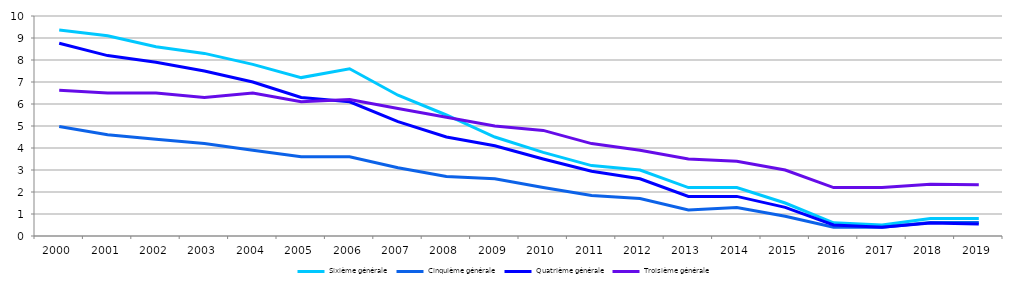
| Category | Sixième générale | Cinquième générale | Quatrième générale | Troisième générale |
|---|---|---|---|---|
| 2000.0 | 9.365 | 4.978 | 8.761 | 6.62 |
| 2001.0 | 9.1 | 4.6 | 8.2 | 6.5 |
| 2002.0 | 8.6 | 4.4 | 7.9 | 6.5 |
| 2003.0 | 8.3 | 4.2 | 7.5 | 6.3 |
| 2004.0 | 7.8 | 3.9 | 7 | 6.5 |
| 2005.0 | 7.2 | 3.6 | 6.3 | 6.1 |
| 2006.0 | 7.6 | 3.6 | 6.1 | 6.2 |
| 2007.0 | 6.4 | 3.1 | 5.2 | 5.8 |
| 2008.0 | 5.5 | 2.7 | 4.5 | 5.4 |
| 2009.0 | 4.5 | 2.6 | 4.1 | 5 |
| 2010.0 | 3.8 | 2.2 | 3.5 | 4.8 |
| 2011.0 | 3.2 | 1.84 | 2.94 | 4.2 |
| 2012.0 | 3 | 1.7 | 2.6 | 3.9 |
| 2013.0 | 2.2 | 1.18 | 1.8 | 3.5 |
| 2014.0 | 2.2 | 1.3 | 1.8 | 3.4 |
| 2015.0 | 1.5 | 0.9 | 1.3 | 3 |
| 2016.0 | 0.6 | 0.4 | 0.5 | 2.2 |
| 2017.0 | 0.5 | 0.4 | 0.4 | 2.2 |
| 2018.0 | 0.8 | 0.61 | 0.59 | 2.35 |
| 2019.0 | 0.8 | 0.61 | 0.54 | 2.33 |